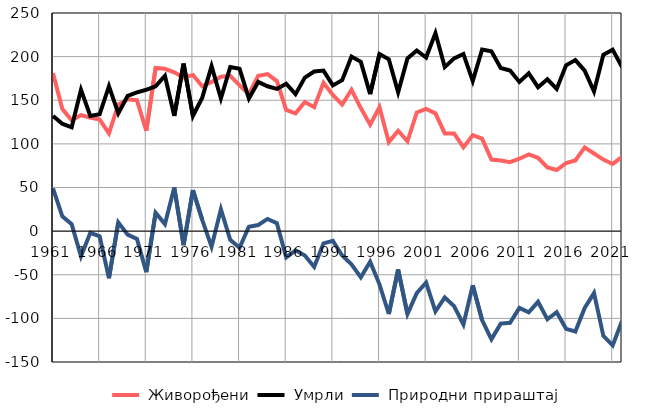
| Category |  Живорођени |  Умрли |  Природни прираштај |
|---|---|---|---|
| 1961.0 | 181 | 132 | 49 |
| 1962.0 | 140 | 123 | 17 |
| 1963.0 | 127 | 119 | 8 |
| 1964.0 | 133 | 162 | -29 |
| 1965.0 | 130 | 132 | -2 |
| 1966.0 | 128 | 134 | -6 |
| 1967.0 | 112 | 166 | -54 |
| 1968.0 | 145 | 135 | 10 |
| 1969.0 | 151 | 155 | -4 |
| 1970.0 | 150 | 159 | -9 |
| 1971.0 | 115 | 162 | -47 |
| 1972.0 | 187 | 166 | 21 |
| 1973.0 | 186 | 178 | 8 |
| 1974.0 | 182 | 132 | 50 |
| 1975.0 | 176 | 192 | -16 |
| 1976.0 | 179 | 132 | 47 |
| 1977.0 | 166 | 153 | 13 |
| 1978.0 | 171 | 189 | -18 |
| 1979.0 | 177 | 152 | 25 |
| 1980.0 | 178 | 188 | -10 |
| 1981.0 | 167 | 186 | -19 |
| 1982.0 | 157 | 152 | 5 |
| 1983.0 | 178 | 171 | 7 |
| 1984.0 | 180 | 166 | 14 |
| 1985.0 | 172 | 163 | 9 |
| 1986.0 | 139 | 169 | -30 |
| 1987.0 | 135 | 157 | -22 |
| 1988.0 | 148 | 176 | -28 |
| 1989.0 | 142 | 183 | -41 |
| 1990.0 | 170 | 184 | -14 |
| 1991.0 | 156 | 167 | -11 |
| 1992.0 | 145 | 173 | -28 |
| 1993.0 | 162 | 200 | -38 |
| 1994.0 | 141 | 194 | -53 |
| 1995.0 | 122 | 157 | -35 |
| 1996.0 | 142 | 203 | -61 |
| 1997.0 | 102 | 197 | -95 |
| 1998.0 | 115 | 159 | -44 |
| 1999.0 | 103 | 198 | -95 |
| 2000.0 | 136 | 207 | -71 |
| 2001.0 | 140 | 199 | -59 |
| 2002.0 | 135 | 227 | -92 |
| 2003.0 | 112 | 188 | -76 |
| 2004.0 | 112 | 198 | -86 |
| 2005.0 | 96 | 203 | -107 |
| 2006.0 | 110 | 172 | -62 |
| 2007.0 | 106 | 208 | -102 |
| 2008.0 | 82 | 206 | -124 |
| 2009.0 | 81 | 187 | -106 |
| 2010.0 | 79 | 184 | -105 |
| 2011.0 | 83 | 171 | -88 |
| 2012.0 | 88 | 181 | -93 |
| 2013.0 | 84 | 165 | -81 |
| 2014.0 | 73 | 174 | -101 |
| 2015.0 | 70 | 163 | -93 |
| 2016.0 | 78 | 190 | -112 |
| 2017.0 | 81 | 196 | -115 |
| 2018.0 | 96 | 184 | -88 |
| 2019.0 | 89 | 160 | -71 |
| 2020.0 | 82 | 202 | -120 |
| 2021.0 | 77 | 208 | -131 |
| 2022.0 | 85 | 188 | -103 |